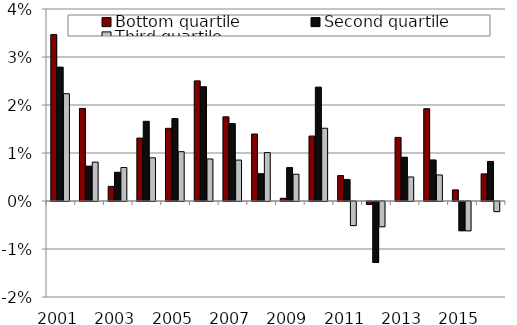
| Category | Bottom quartile | Second quartile | Third quartile |
|---|---|---|---|
| 2001.0 | 0.035 | 0.028 | 0.022 |
| 2002.0 | 0.019 | 0.007 | 0.008 |
| 2003.0 | 0.003 | 0.006 | 0.007 |
| 2004.0 | 0.013 | 0.017 | 0.009 |
| 2005.0 | 0.015 | 0.017 | 0.01 |
| 2006.0 | 0.025 | 0.024 | 0.009 |
| 2007.0 | 0.018 | 0.016 | 0.009 |
| 2008.0 | 0.014 | 0.006 | 0.01 |
| 2009.0 | 0.001 | 0.007 | 0.006 |
| 2010.0 | 0.014 | 0.024 | 0.015 |
| 2011.0 | 0.005 | 0.004 | -0.005 |
| 2012.0 | -0.001 | -0.013 | -0.005 |
| 2013.0 | 0.013 | 0.009 | 0.005 |
| 2014.0 | 0.019 | 0.009 | 0.005 |
| 2015.0 | 0.002 | -0.006 | -0.006 |
| 2016.0 | 0.006 | 0.008 | -0.002 |